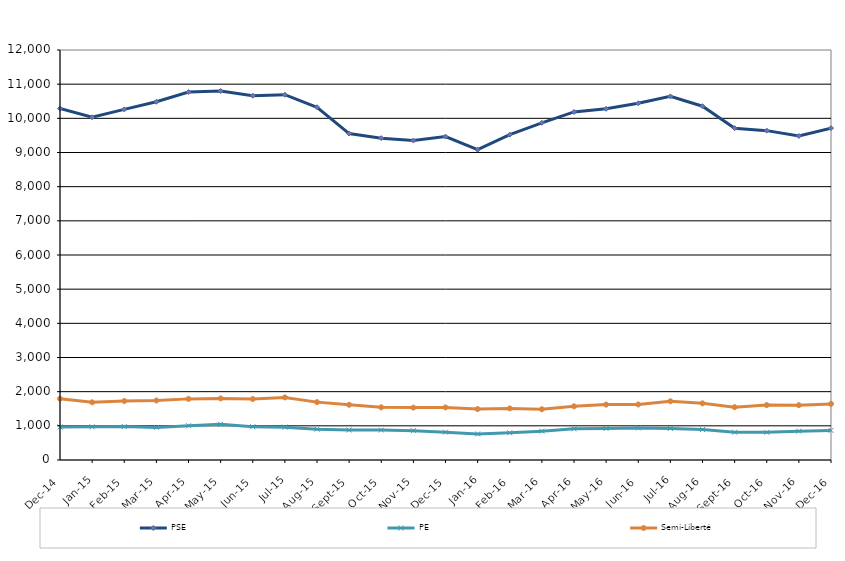
| Category | PSE | PE | Semi-Liberté |
|---|---|---|---|
| 2014-12-01 | 10287 | 966 | 1794 |
| 2015-01-01 | 10030 | 970 | 1689 |
| 2015-02-01 | 10261 | 977 | 1726 |
| 2015-03-01 | 10485 | 954 | 1742 |
| 2015-04-01 | 10770 | 1003 | 1789 |
| 2015-05-01 | 10801 | 1043 | 1803 |
| 2015-06-01 | 10662 | 973 | 1785 |
| 2015-07-01 | 10692 | 961 | 1832 |
| 2015-08-01 | 10325 | 903 | 1694 |
| 2015-09-01 | 9555 | 878 | 1616 |
| 2015-10-01 | 9420 | 877 | 1542 |
| 2015-11-01 | 9350 | 859 | 1533 |
| 2015-12-01 | 9466 | 815 | 1539 |
| 2016-01-01 | 9081 | 764 | 1490 |
| 2016-02-01 | 9521 | 798 | 1510 |
| 2016-03-01 | 9868 | 845 | 1486 |
| 2016-04-01 | 10187 | 912 | 1572 |
| 2016-05-01 | 10278 | 920 | 1621 |
| 2016-06-01 | 10441 | 939 | 1625 |
| 2016-07-01 | 10642 | 923 | 1718 |
| 2016-08-01 | 10355 | 890 | 1658 |
| 2016-09-01 | 9712 | 813 | 1546 |
| 2016-10-01 | 9640 | 809 | 1607 |
| 2016-11-01 | 9484 | 844 | 1605 |
| 2016-12-01 | 9714 | 866 | 1641 |